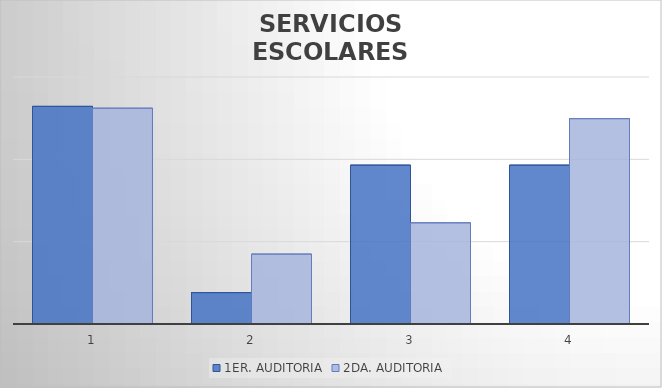
| Category | 1ER. AUDITORIA | 2DA. AUDITORIA |
|---|---|---|
| 0 | 4.482 | 4.481 |
| 1 | 4.369 | 4.392 |
| 2 | 4.446 | 4.411 |
| 3 | 4.446 | 4.475 |